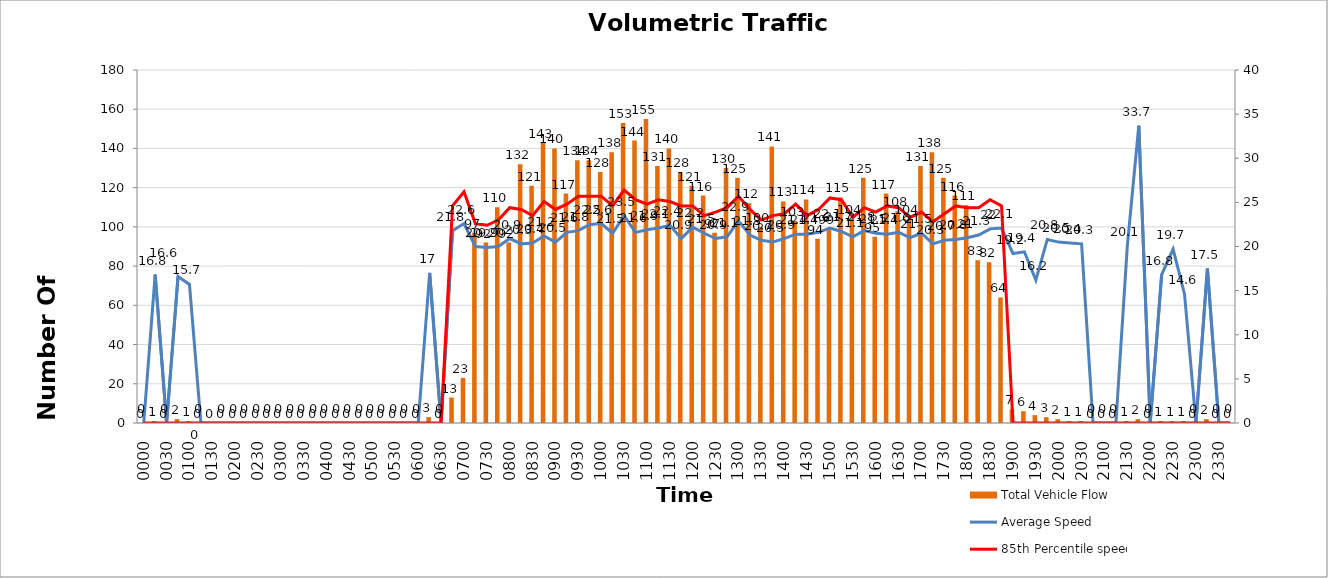
| Category | Total Vehicle Flow |
|---|---|
| 0000 | 0 |
| 0015 | 1 |
| 0030 | 0 |
| 0045 | 2 |
| 0100 | 1 |
| 0115 | 0 |
| 0130 | 0 |
| 0145 | 0 |
| 0200 | 0 |
| 0215 | 0 |
| 0230 | 0 |
| 0245 | 0 |
| 0300 | 0 |
| 0315 | 0 |
| 0330 | 0 |
| 0345 | 0 |
| 0400 | 0 |
| 0415 | 0 |
| 0430 | 0 |
| 0445 | 0 |
| 0500 | 0 |
| 0515 | 0 |
| 0530 | 0 |
| 0545 | 0 |
| 0600 | 0 |
| 0615 | 3 |
| 0630 | 0 |
| 0645 | 13 |
| 0700 | 23 |
| 0715 | 97 |
| 0730 | 92 |
| 0745 | 110 |
| 0800 | 92 |
| 0815 | 132 |
| 0830 | 121 |
| 0845 | 143 |
| 0900 | 140 |
| 0915 | 117 |
| 0930 | 134 |
| 0945 | 134 |
| 1000 | 128 |
| 1015 | 138 |
| 1030 | 153 |
| 1045 | 144 |
| 1100 | 155 |
| 1115 | 131 |
| 1130 | 140 |
| 1145 | 128 |
| 1200 | 121 |
| 1215 | 116 |
| 1230 | 97 |
| 1245 | 130 |
| 1300 | 125 |
| 1315 | 112 |
| 1330 | 100 |
| 1345 | 141 |
| 1400 | 113 |
| 1415 | 103 |
| 1430 | 114 |
| 1445 | 94 |
| 1500 | 99 |
| 1515 | 115 |
| 1530 | 104 |
| 1545 | 125 |
| 1600 | 95 |
| 1615 | 117 |
| 1630 | 108 |
| 1645 | 104 |
| 1700 | 131 |
| 1715 | 138 |
| 1730 | 125 |
| 1745 | 116 |
| 1800 | 111 |
| 1815 | 83 |
| 1830 | 82 |
| 1845 | 64 |
| 1900 | 7 |
| 1915 | 6 |
| 1930 | 4 |
| 1945 | 3 |
| 2000 | 2 |
| 2015 | 1 |
| 2030 | 1 |
| 2045 | 0 |
| 2100 | 0 |
| 2115 | 0 |
| 2130 | 1 |
| 2145 | 2 |
| 2200 | 0 |
| 2215 | 1 |
| 2230 | 1 |
| 2245 | 1 |
| 2300 | 0 |
| 2315 | 2 |
| 2330 | 0 |
| 2345 | 0 |